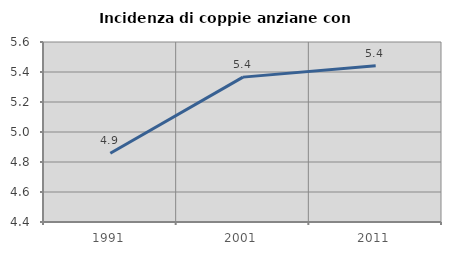
| Category | Incidenza di coppie anziane con figli |
|---|---|
| 1991.0 | 4.858 |
| 2001.0 | 5.366 |
| 2011.0 | 5.442 |